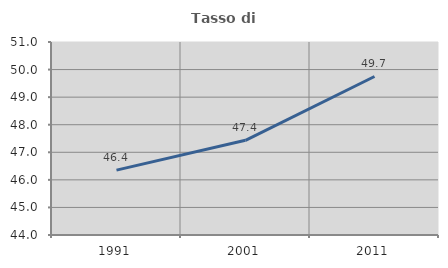
| Category | Tasso di occupazione   |
|---|---|
| 1991.0 | 46.354 |
| 2001.0 | 47.435 |
| 2011.0 | 49.749 |